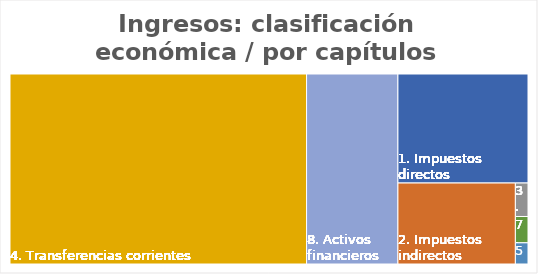
| Category | Series 0 |
|---|---|
| 1. Impuestos directos | 0.144 |
| 2. Impuestos indirectos | 0.097 |
| 3. Tasas, precios públicos y otros ing. | 0.004 |
| 4. Transferencias corrientes | 0.573 |
| 5. Ingresos patrimoniales | 0.003 |
| 7. Transferencias de capital | 0.003 |
| 8. Activos financieros | 0.176 |